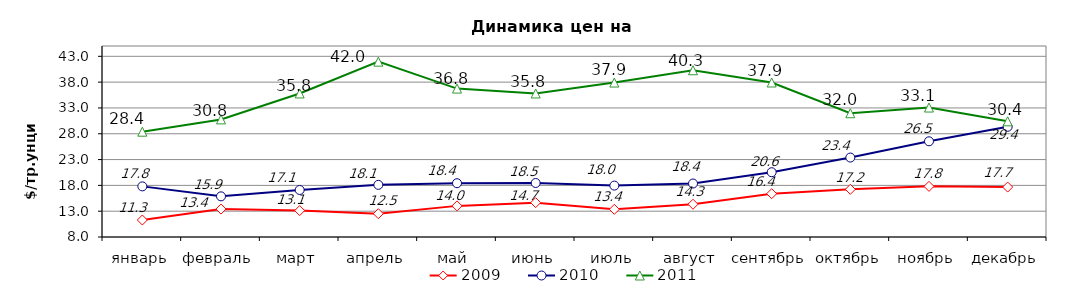
| Category | 2009 | 2010 | 2011 |
|---|---|---|---|
| январь | 11.291 | 17.806 | 28.4 |
| февраль | 13.412 | 15.873 | 30.78 |
| март | 13.117 | 17.11 | 35.81 |
| апрель | 12.515 | 18.1 | 41.97 |
| май | 14.029 | 18.42 | 36.75 |
| июнь | 14.65 | 18.46 | 35.8 |
| июль | 13.362 | 17.96 | 37.92 |
| август | 14.348 | 18.36 | 40.3 |
| сентябрь | 16.39 | 20.55 | 37.93 |
| октябрь | 17.236 | 23.39 | 31.975 |
| ноябрь | 17.81 | 26.54 | 33.08 |
| декабрь | 17.673 | 29.35 | 30.41 |